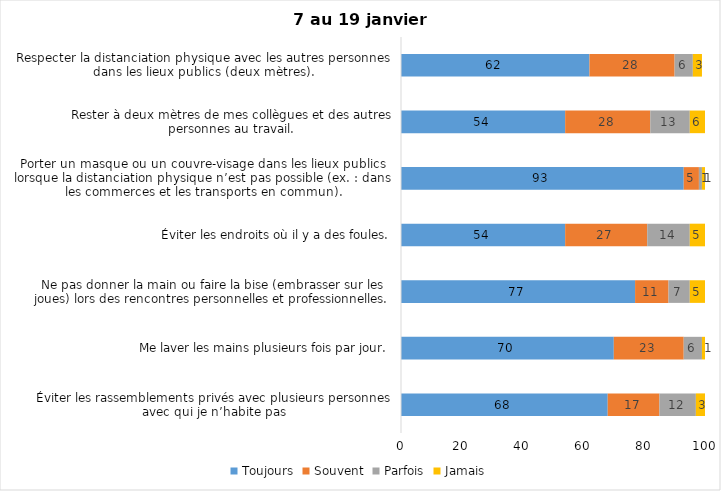
| Category | Toujours | Souvent | Parfois | Jamais |
|---|---|---|---|---|
| Éviter les rassemblements privés avec plusieurs personnes avec qui je n’habite pas | 68 | 17 | 12 | 3 |
| Me laver les mains plusieurs fois par jour. | 70 | 23 | 6 | 1 |
| Ne pas donner la main ou faire la bise (embrasser sur les joues) lors des rencontres personnelles et professionnelles. | 77 | 11 | 7 | 5 |
| Éviter les endroits où il y a des foules. | 54 | 27 | 14 | 5 |
| Porter un masque ou un couvre-visage dans les lieux publics lorsque la distanciation physique n’est pas possible (ex. : dans les commerces et les transports en commun). | 93 | 5 | 1 | 1 |
| Rester à deux mètres de mes collègues et des autres personnes au travail. | 54 | 28 | 13 | 6 |
| Respecter la distanciation physique avec les autres personnes dans les lieux publics (deux mètres). | 62 | 28 | 6 | 3 |